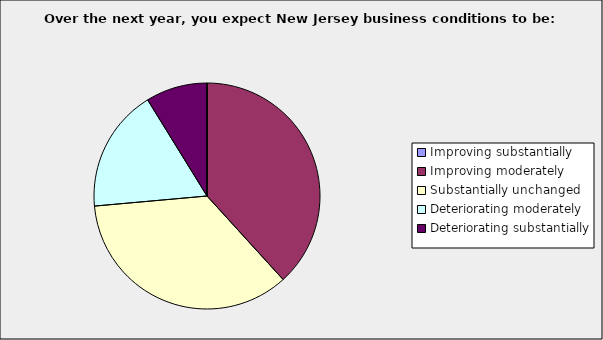
| Category | Series 0 |
|---|---|
| Improving substantially | 0 |
| Improving moderately | 0.382 |
| Substantially unchanged | 0.353 |
| Deteriorating moderately | 0.176 |
| Deteriorating substantially | 0.088 |